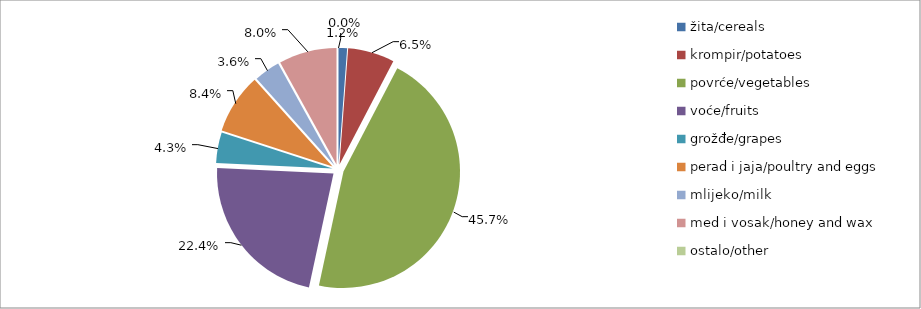
| Category | Series 0 |
|---|---|
| žita/cereals | 22132 |
| krompir/potatoes | 120673 |
| povrće/vegetables | 854834 |
| voće/fruits | 417738 |
| grožđe/grapes | 79551 |
| perad i jaja/poultry and eggs | 156239 |
| mlijeko/milk | 67552 |
| med i vosak/honey and wax | 150140 |
| ostalo/other | 0 |